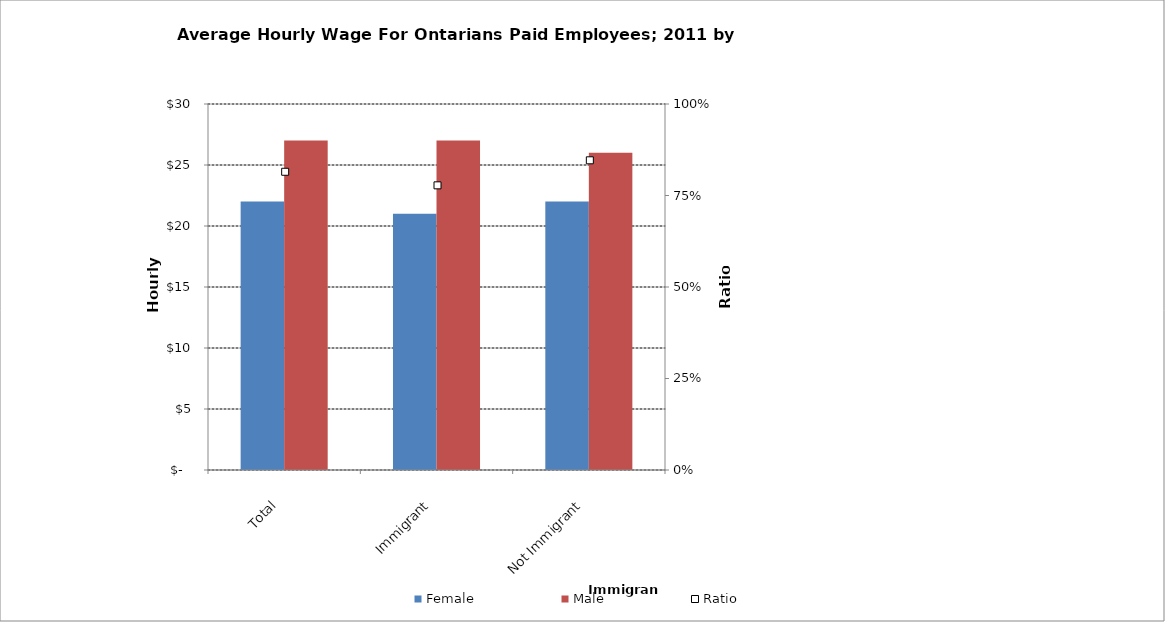
| Category | Female | Male |
|---|---|---|
| Total | 22 | 27 |
|  Immigrant  | 21 | 27 |
|  Not Immigrant  | 22 | 26 |